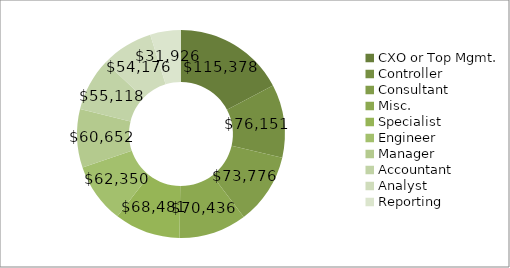
| Category | Total |
|---|---|
| CXO or Top Mgmt. | 115377.745 |
| Controller | 76150.714 |
| Consultant | 73776.46 |
| Misc. | 70435.939 |
| Specialist | 68481.187 |
| Engineer | 62350.448 |
| Manager | 60652.144 |
| Accountant | 55117.986 |
| Analyst | 54175.965 |
| Reporting | 31925.776 |